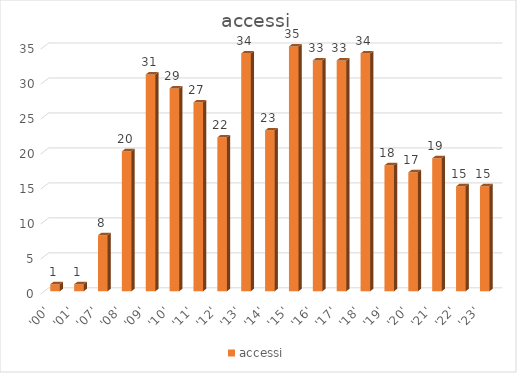
| Category | accessi |
|---|---|
| '00' | 1 |
| '01' | 1 |
| '07' | 8 |
| '08' | 20 |
| '09' | 31 |
| '10' | 29 |
| '11' | 27 |
| '12' | 22 |
| '13' | 34 |
| '14' | 23 |
| '15' | 35 |
| '16' | 33 |
| '17' | 33 |
| '18' | 34 |
| '19' | 18 |
| '20' | 17 |
| '21' | 19 |
| '22' | 15 |
| '23' | 15 |